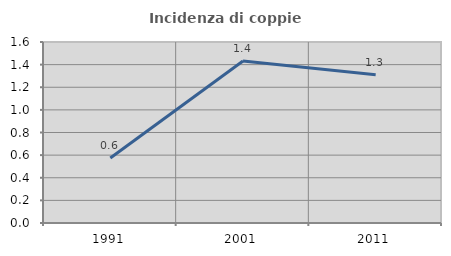
| Category | Incidenza di coppie miste |
|---|---|
| 1991.0 | 0.575 |
| 2001.0 | 1.432 |
| 2011.0 | 1.31 |